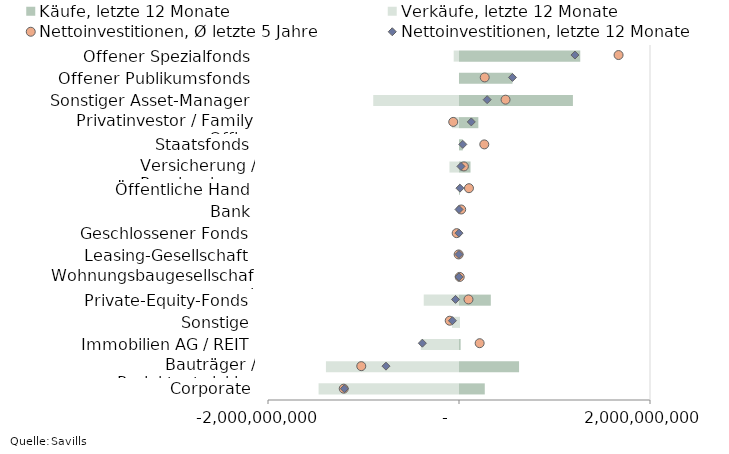
| Category | Käufe, letzte 12 Monate | Verkäufe, letzte 12 Monate |
|---|---|---|
| Corporate | 269985667.98 | -1470373470.97 |
| Bauträger / Projektentwickler | 628855618.49 | -1393361447.97 |
| Immobilien AG / REIT | 17200000 | -400750400 |
| Sonstige | 4999999 | -73875278 |
| Private-Equity-Fonds | 333029599 | -369408029.97 |
| Wohnungsbaugesellschaft | 0 | 0 |
| Leasing-Gesellschaft | 0 | 0 |
| Geschlossener Fonds | 0 | 0 |
| Bank | 0 | 0 |
| Öffentliche Hand | 10104746 | -132000 |
| Versicherung / Pensionskasse | 120376000 | -100000000 |
| Staatsfonds | 40000000 | 0 |
| Privatinvestor / Family Office | 202566128.5 | -73752719 |
| Sonstiger Asset-Manager | 1192929308.95 | -897999879.98 |
| Offener Publikumsfonds | 559999999.97 | 0 |
| Offener Spezialfonds | 1269534320 | -55649500 |